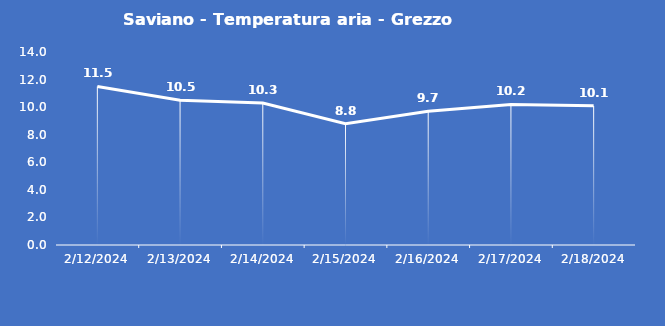
| Category | Saviano - Temperatura aria - Grezzo (°C) |
|---|---|
| 2/12/24 | 11.5 |
| 2/13/24 | 10.5 |
| 2/14/24 | 10.3 |
| 2/15/24 | 8.8 |
| 2/16/24 | 9.7 |
| 2/17/24 | 10.2 |
| 2/18/24 | 10.1 |